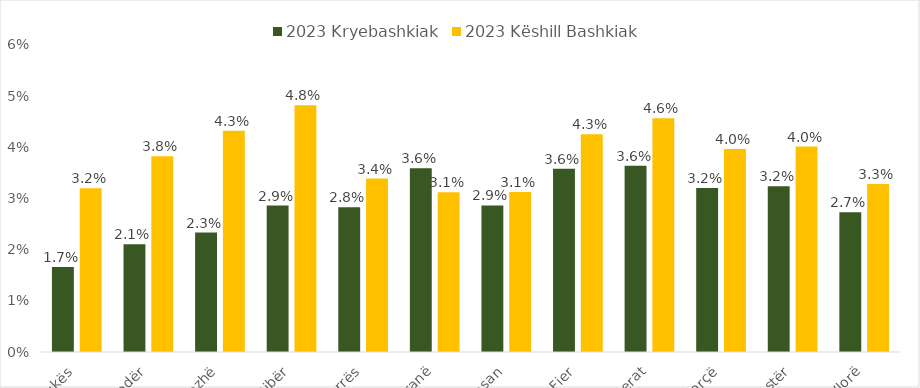
| Category | 2023 Kryebashkiak | 2023 Këshill Bashkiak |
|---|---|---|
| Kukës | 0.017 | 0.032 |
| Shkodër | 0.021 | 0.038 |
| Lezhë | 0.023 | 0.043 |
| Dibër | 0.029 | 0.048 |
| Durrës | 0.028 | 0.034 |
| Tiranë | 0.036 | 0.031 |
| Elbasan | 0.029 | 0.031 |
| Fier | 0.036 | 0.043 |
| Berat | 0.036 | 0.046 |
| Korçë | 0.032 | 0.04 |
| Gjirokastër | 0.032 | 0.04 |
| Vlorë | 0.027 | 0.033 |